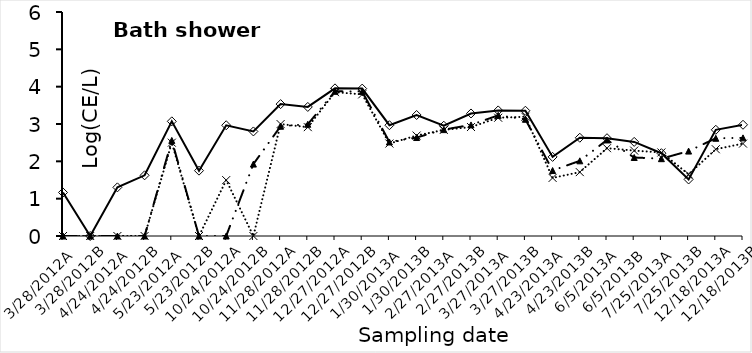
| Category | Legionella  | rtxA  | P65/66  |
|---|---|---|---|
| 3/28/2012A | 1.166 | 0 | 0 |
| 3/28/2012B | 0 | 0 | 0 |
| 4/24/2012A | 1.303 | 0 | 0 |
| 4/24/2012B | 1.625 | 0 | 0 |
| 5/23/2012A | 3.071 | 2.56 | 2.5 |
| 5/23/2012B | 1.75 | 0 | 0 |
| 10/24/2012A | 2.966 | 0 | 1.497 |
| 10/24/2012B | 2.801 | 1.927 | 0 |
| 11/28/2012A | 3.533 | 2.94 | 2.998 |
| 11/28/2012B | 3.457 | 2.993 | 2.915 |
| 12/27/2012A | 3.954 | 3.875 | 3.853 |
| 12/27/2012B | 3.948 | 3.872 | 3.793 |
| 1/30/2013A | 2.967 | 2.518 | 2.477 |
| 1/30/2013B | 3.241 | 2.638 | 2.69 |
| 2/27/2013A | 2.953 | 2.85 | 2.842 |
| 2/27/2013B | 3.282 | 2.975 | 2.919 |
| 3/27/2013A | 3.364 | 3.232 | 3.168 |
| 3/27/2013B | 3.356 | 3.127 | 3.194 |
| 4/23/2013A | 2.119 | 1.754 | 1.556 |
| 4/23/2013B | 2.632 | 2.014 | 1.711 |
| 6/5/2013A | 2.62 | 2.572 | 2.353 |
| 6/5/2013B | 2.521 | 2.103 | 2.287 |
| 7/25/2013A | 2.218 | 2.071 | 2.238 |
| 7/25/2013B | 1.514 | 2.275 | 1.653 |
| 12/18/2013A | 2.845 | 2.618 | 2.324 |
| 12/18/2013B | 2.979 | 2.628 | 2.475 |